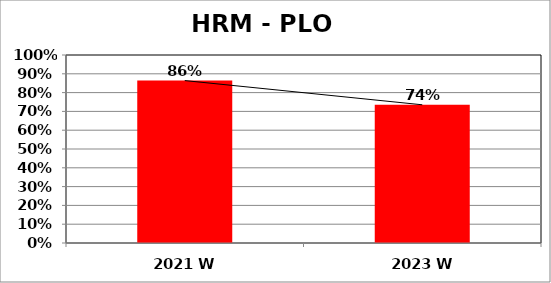
| Category | Series 0 |
|---|---|
| 2021 W | 0.864 |
| 2023 W | 0.735 |